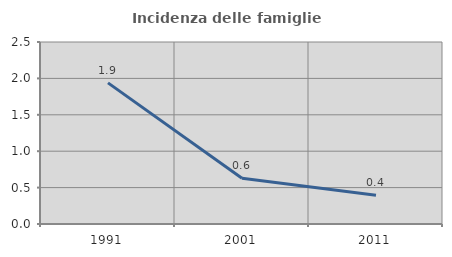
| Category | Incidenza delle famiglie numerose |
|---|---|
| 1991.0 | 1.938 |
| 2001.0 | 0.629 |
| 2011.0 | 0.394 |